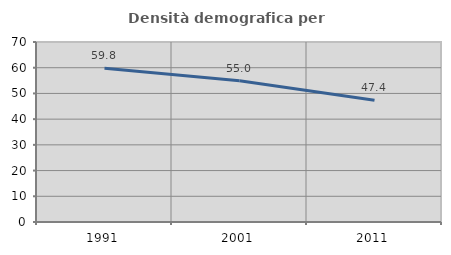
| Category | Densità demografica |
|---|---|
| 1991.0 | 59.815 |
| 2001.0 | 54.957 |
| 2011.0 | 47.351 |